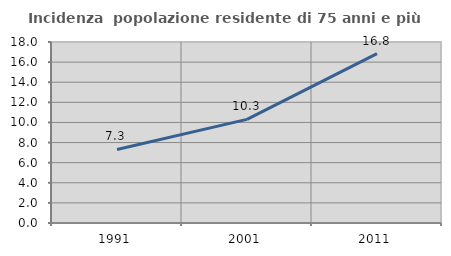
| Category | Incidenza  popolazione residente di 75 anni e più |
|---|---|
| 1991.0 | 7.317 |
| 2001.0 | 10.305 |
| 2011.0 | 16.842 |